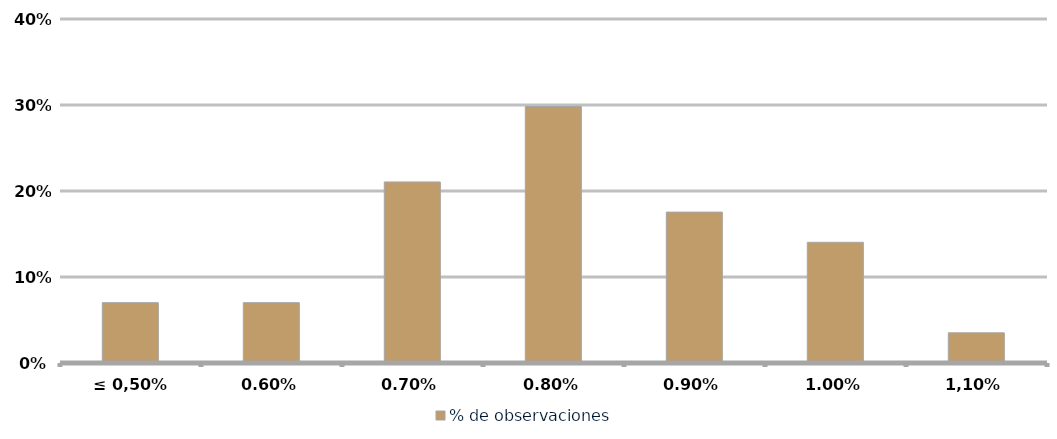
| Category | % de observaciones  |
|---|---|
| ≤ 0,50% | 0.07 |
| 0,60% | 0.07 |
| 0,70% | 0.211 |
| 0,80% | 0.298 |
| 0,90% | 0.175 |
| 1,00% | 0.14 |
| 1,10% | 0.035 |